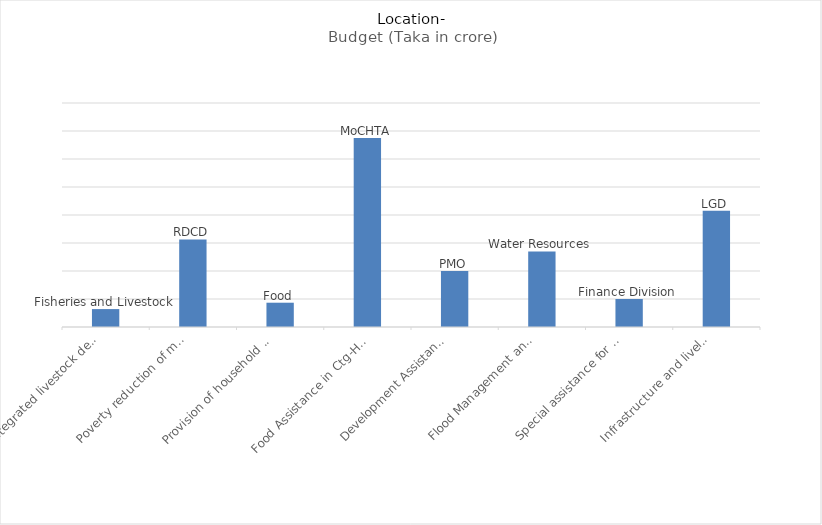
| Category | Budget (Taka in crore) |
|---|---|
| Integrated livestock development to improve the socio-economic and standard of life of the backward
minorities living in the plain land | 32 |
| Poverty reduction of marginalized population and ensuring employment of the extreme poor in northern areas/ production and marketing of nutritious high value
cereals | 156.32 |
| Provision of household silos for safe food storage for the poor, backward minorities, and people
in disaster-prone areas | 43.37 |
| Food Assistance in Ctg-HTA | 337.31 |
| Development Assistance for
Special Areas (Except CHT) | 100 |
| Flood Management and
Livelihood Improvement Project in Char/Haor Area | 135 |
| Special assistance for development of people in chars,
haors and backward areas | 50 |
| Infrastructure and livelihood Improvement in Haor and Costal
Area | 207.61 |